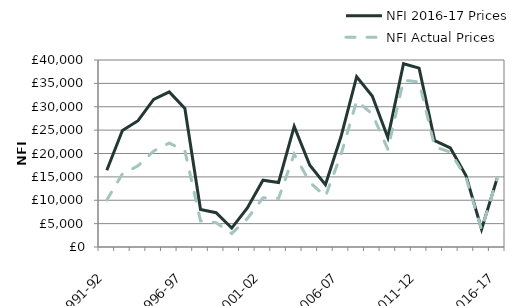
| Category | NFI 2016-17 Prices | NFI Actual Prices |
|---|---|---|
|  1991-92 | 16417.228 | 10059 |
|  1992-93 | 24905.264 | 15642 |
|  1993-94 | 27017.02 | 17366 |
|  1994-95 | 31557.906 | 20524 |
|  1995-96 | 33185.101 | 22238 |
|  1996-97 | 29617.041 | 20564 |
|  1997-98 | 8003.202 | 5598 |
|  1998-99 | 7329.415 | 5200 |
|  1999-00 | 4040.191 | 2879 |
|  2000-01 | 8353.498 | 6076 |
|  2001-02 | 14293.087 | 10524 |
|  2002-03 | 13801.707 | 10400 |
|  2003-04 | 25807.122 | 19872 |
|  2004-05 | 17483.101 | 13837 |
|  2005-06 | 13313.467 | 10812 |
|  2006-07 | 23623.664 | 19786 |
|  2007-08 | 36429.62 | 31269 |
|  2008-09 | 32308.356 | 28453 |
|  2009-10 | 23384.707 | 20893.3 |
|  2010-11 | 39208.279 | 35671.3 |
|  2011-12 | 38257.647 | 35307.6 |
|  2012-13 | 22736.45 | 21419.1 |
|  2013-14 | 21180.4 | 20294 |
|  2014-15 | 15297.004 | 14869.3 |
|  2015-16 | 3803.904 | 3722.5 |
|  2016-17 | 14740.3 | 14740.3 |